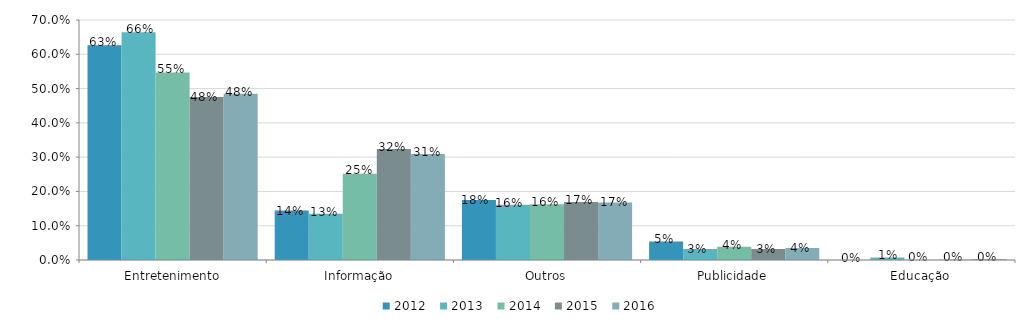
| Category | 2012 | 2013 | 2014 | 2015 | 2016 |
|---|---|---|---|---|---|
| Entretenimento | 0.626 | 0.665 | 0.547 | 0.475 | 0.485 |
| Informação | 0.144 | 0.135 | 0.251 | 0.323 | 0.309 |
| Outros | 0.175 | 0.161 | 0.163 | 0.169 | 0.168 |
| Publicidade | 0.054 | 0.032 | 0.039 | 0.032 | 0.035 |
| Educação | 0 | 0.008 | 0 | 0 | 0.003 |